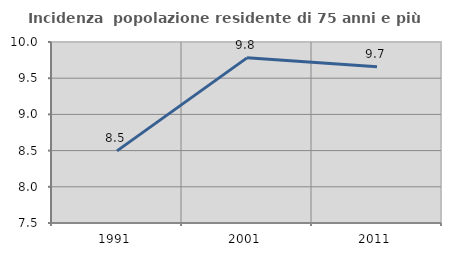
| Category | Incidenza  popolazione residente di 75 anni e più |
|---|---|
| 1991.0 | 8.496 |
| 2001.0 | 9.781 |
| 2011.0 | 9.659 |